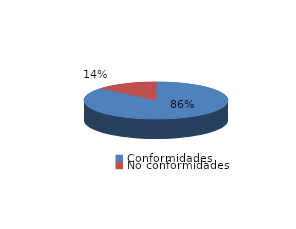
| Category | Series 0 |
|---|---|
| Conformidades | 275 |
| No conformidades | 44 |